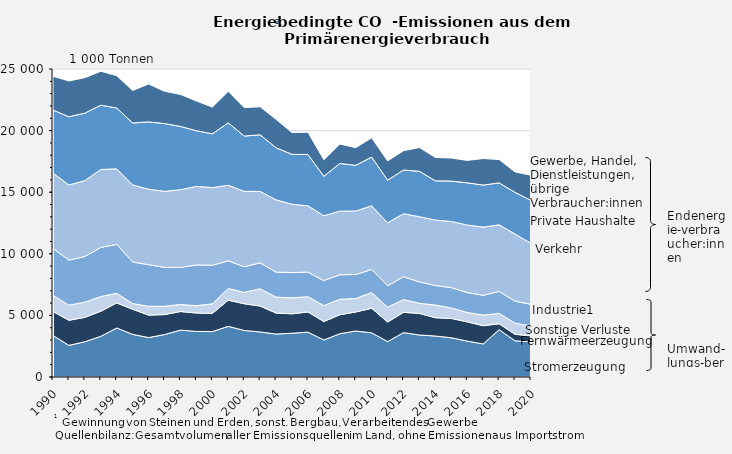
| Category | Stromerzeugung | Fernwärmeerzeugung | Sonstige Verluste | Industrie1 | Verkehr | Private Haushalte | Gewerbe, Handel, Dienstleistungen, übrige Verbraucher:innen |
|---|---|---|---|---|---|---|---|
| 1990.0 | 3371.486 | 1943.547 | 1320.394 | 3804.727 | 6112.816 | 5116.565 | 2742.045 |
| 1991.0 | 2567.638 | 2036.341 | 1227.548 | 3657.508 | 6098.15 | 5539.379 | 2901.175 |
| 1992.0 | 2865.272 | 1974.446 | 1236.431 | 3705.024 | 6162.39 | 5476.347 | 2877.899 |
| 1993.0 | 3299.486 | 2038.85 | 1193.324 | 3989.26 | 6324.022 | 5217.371 | 2755.161 |
| 1994.0 | 3978.563 | 2034.488 | 780.207 | 3971.838 | 6134.103 | 4934.446 | 2627.258 |
| 1995.0 | 3461.174 | 2037.907 | 461.206 | 3383.339 | 6249.129 | 5026.487 | 2634.874 |
| 1996.0 | 3200.925 | 1824.56 | 714.035 | 3374.85 | 6128.805 | 5465.821 | 3070.011 |
| 1997.0 | 3444.901 | 1621.57 | 676.661 | 3159.924 | 6166.729 | 5497.646 | 2622.821 |
| 1998.0 | 3806.562 | 1507.285 | 570.944 | 3008.594 | 6306.922 | 5139.531 | 2595.114 |
| 1999.0 | 3701.846 | 1494.129 | 593.502 | 3308.974 | 6370.874 | 4520.523 | 2415.679 |
| 2000.0 | 3684.83 | 1480.565 | 774.837 | 3128.248 | 6304.226 | 4368.588 | 2165.202 |
| 2001.0 | 4114.152 | 2123.547 | 949.324 | 2245.338 | 6132.787 | 5069.669 | 2550.382 |
| 2002.0 | 3778.969 | 2167.503 | 924.024 | 2075.858 | 6126.35 | 4482.009 | 2311.335 |
| 2003.0 | 3657.903 | 2103.241 | 1397.822 | 2106.054 | 5801.612 | 4594.38 | 2274.209 |
| 2004.0 | 3486.007 | 1703.968 | 1293.687 | 2030.891 | 5867.799 | 4227.637 | 2303.604 |
| 2005.0 | 3552.044 | 1578.614 | 1294.132 | 2054.86 | 5540.796 | 4050.809 | 1764.411 |
| 2006.0 | 3643.907 | 1638.247 | 1238.972 | 1997.205 | 5378.38 | 4170.409 | 1805.938 |
| 2007.0 | 3004.687 | 1496.461 | 1292.318 | 2035.318 | 5262.188 | 3199.223 | 1336.259 |
| 2008.0 | 3509.988 | 1542.883 | 1256.852 | 1988.054 | 5164.237 | 3870.983 | 1578.564 |
| 2009.0 | 3734.75 | 1542.786 | 1095.011 | 1945.8 | 5155.296 | 3709.951 | 1429.667 |
| 2010.0 | 3585.919 | 1996.268 | 1267.868 | 1881.478 | 5162.522 | 3959.148 | 1558.676 |
| 2011.0 | 2879.738 | 1581.922 | 1206.749 | 1739.39 | 5109.738 | 3457.373 | 1565.613 |
| 2012.0 | 3601.462 | 1648.576 | 1033.744 | 1851.217 | 5118.803 | 3548.876 | 1562.921 |
| 2013.0 | 3411.194 | 1751.155 | 819.848 | 1739.787 | 5290.308 | 3681.455 | 1930.714 |
| 2014.0 | 3327.141 | 1483.993 | 1029.947 | 1584.828 | 5308.429 | 3189.364 | 1894.706 |
| 2015.0 | 3184.54 | 1570.25 | 847.294 | 1651.277 | 5371.008 | 3281.79 | 1864.106 |
| 2016.0 | 2916.005 | 1558.909 | 764.577 | 1612.66 | 5488.009 | 3420.129 | 1822.097 |
| 2017.0 | 2683.979 | 1481.155 | 862.72 | 1603.128 | 5535.211 | 3413.039 | 2152.072 |
| 2018.0 | 3845.35 | 476.238 | 839.922 | 1787.701 | 5406.358 | 3403.149 | 1892.334 |
| 2019.0 | 2936.723 | 528.538 | 907.178 | 1789.053 | 5440.168 | 3384.399 | 1659.806 |
| 2020.0 | 2862.521 | 478.3 | 807.389 | 1747.903 | 4953.515 | 3481.888 | 2045.473 |